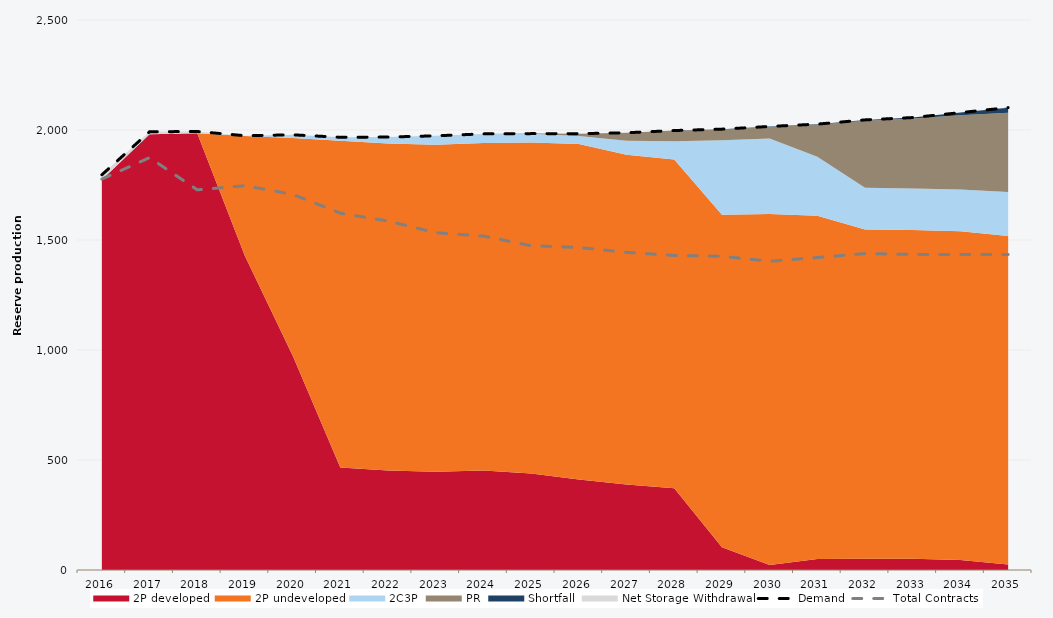
| Category | Demand | Total Contracts |
|---|---|---|
| 0 | 1796.461 | 1776.781 |
| 1 | 1992.016 | 1874.371 |
| 2 | 1993.159 | 1727.997 |
| 3 | 1974.021 | 1746.967 |
| 4 | 1978.1 | 1707.643 |
| 5 | 1966.91 | 1621.977 |
| 6 | 1967.937 | 1586.126 |
| 7 | 1973.509 | 1533.126 |
| 8 | 1982.37 | 1517.777 |
| 9 | 1983.534 | 1474.136 |
| 10 | 1983.321 | 1466.013 |
| 11 | 1987.361 | 1443.817 |
| 12 | 1997.544 | 1429.645 |
| 13 | 2003.869 | 1425.788 |
| 14 | 2016.117 | 1403.548 |
| 15 | 2026.679 | 1420.349 |
| 16 | 2045.948 | 1438.314 |
| 17 | 2056.572 | 1434.467 |
| 18 | 2078.974 | 1434.453 |
| 19 | 2101.786 | 1434.032 |